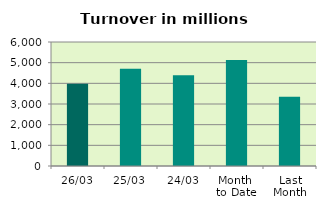
| Category | Series 0 |
|---|---|
| 26/03 | 3980.407 |
| 25/03 | 4710.422 |
| 24/03 | 4385.97 |
| Month 
to Date | 5126.912 |
| Last
Month | 3347.876 |